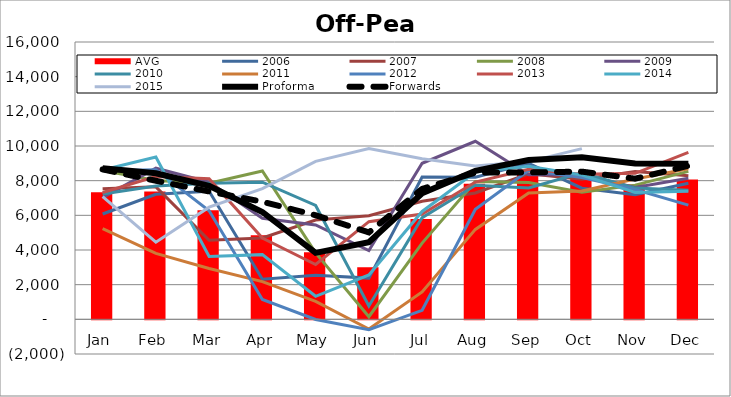
| Category | AVG |
|---|---|
| Jan | 7326.848 |
| Feb | 7377.898 |
| Mar | 6297.11 |
| Apr | 4858.009 |
| May | 3874.753 |
| Jun | 3011.758 |
| Jul | 5794.548 |
| Aug | 7824.295 |
| Sep | 8368.863 |
| Oct | 8191.294 |
| Nov | 7775.015 |
| Dec | 8062.984 |